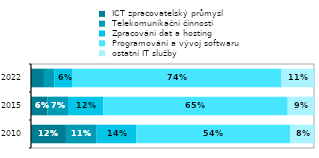
| Category |  ICT zpracovatelský průmysl |  Telekomunikační činnosti  |  Zpracování dat a hosting |  Programování a vývoj softwaru |  ostatní IT služby  |
|---|---|---|---|---|---|
| 2010.0 | 0.124 | 0.108 | 0.141 | 0.544 | 0.083 |
| 2015.0 | 0.058 | 0.073 | 0.125 | 0.652 | 0.093 |
| 2022.0 | 0.046 | 0.036 | 0.063 | 0.74 | 0.115 |